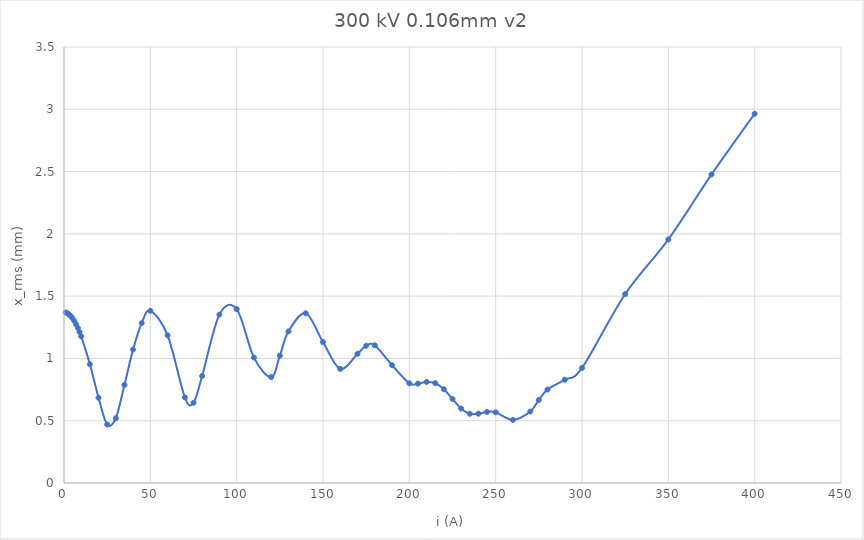
| Category | Series 0 |
|---|---|
| 1.0 | 1.369 |
| 2.0 | 1.363 |
| 3.0 | 1.353 |
| 4.0 | 1.339 |
| 5.0 | 1.321 |
| 6.0 | 1.299 |
| 7.0 | 1.274 |
| 8.0 | 1.245 |
| 9.0 | 1.213 |
| 10.0 | 1.177 |
| 15.0 | 0.954 |
| 20.0 | 0.685 |
| 25.0 | 0.47 |
| 30.0 | 0.52 |
| 35.0 | 0.787 |
| 40.0 | 1.071 |
| 45.0 | 1.284 |
| 50.0 | 1.382 |
| 60.0 | 1.185 |
| 70.0 | 0.687 |
| 75.0 | 0.644 |
| 80.0 | 0.859 |
| 90.0 | 1.352 |
| 100.0 | 1.395 |
| 110.0 | 1.007 |
| 120.0 | 0.85 |
| 125.0 | 1.022 |
| 130.0 | 1.217 |
| 140.0 | 1.362 |
| 150.0 | 1.131 |
| 160.0 | 0.916 |
| 170.0 | 1.037 |
| 175.0 | 1.102 |
| 180.0 | 1.105 |
| 190.0 | 0.946 |
| 200.0 | 0.8 |
| 205.0 | 0.798 |
| 210.0 | 0.811 |
| 215.0 | 0.801 |
| 220.0 | 0.753 |
| 225.0 | 0.674 |
| 230.0 | 0.598 |
| 235.0 | 0.556 |
| 240.0 | 0.556 |
| 245.0 | 0.571 |
| 250.0 | 0.568 |
| 260.0 | 0.506 |
| 270.0 | 0.573 |
| 275.0 | 0.666 |
| 280.0 | 0.75 |
| 290.0 | 0.829 |
| 300.0 | 0.924 |
| 325.0 | 1.516 |
| 350.0 | 1.955 |
| 375.0 | 2.476 |
| 400.0 | 2.964 |